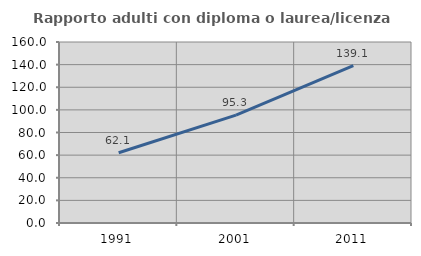
| Category | Rapporto adulti con diploma o laurea/licenza media  |
|---|---|
| 1991.0 | 62.115 |
| 2001.0 | 95.335 |
| 2011.0 | 139.136 |